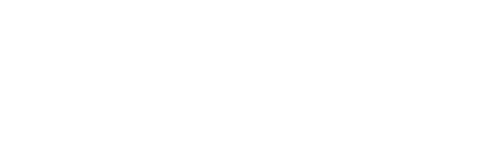
| Category | Collected | Difference |
|---|---|---|
| 0 | 0 | 0 |